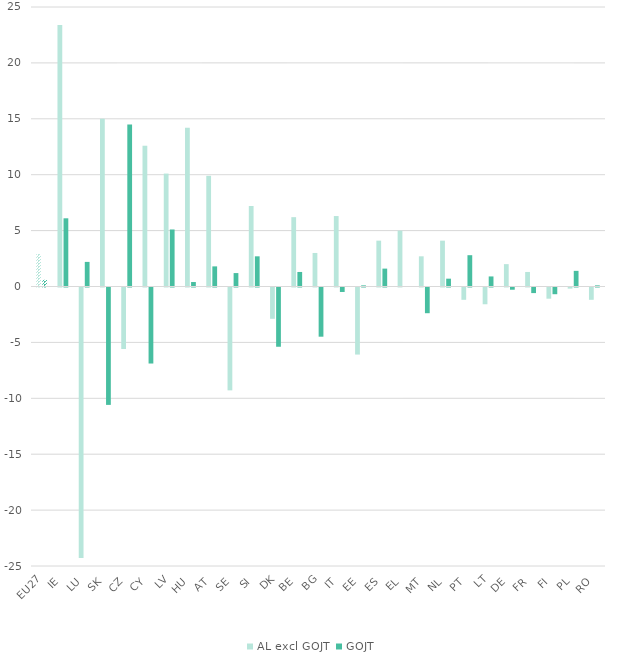
| Category | AL excl GOJT | GOJT |
|---|---|---|
| EU27 | 2.9 | 0.6 |
| IE | 23.4 | 6.1 |
| LU | -24.2 | 2.2 |
| SK | 15 | -10.5 |
| CZ | -5.5 | 14.5 |
| CY | 12.6 | -6.8 |
| LV | 10.1 | 5.1 |
| HU | 14.2 | 0.4 |
| AT | 9.9 | 1.8 |
| SE | -9.2 | 1.2 |
| SI | 7.2 | 2.7 |
| DK | -2.8 | -5.3 |
| BE | 6.2 | 1.3 |
| BG | 3 | -4.4 |
| IT | 6.3 | -0.4 |
| EE | -6 | 0.1 |
| ES | 4.1 | 1.6 |
| EL | 5 | 0 |
| MT | 2.7 | -2.3 |
| NL | 4.1 | 0.7 |
| PT | -1.1 | 2.8 |
| LT | -1.5 | 0.9 |
| DE | 2 | -0.2 |
| FR | 1.3 | -0.5 |
| FI | -1 | -0.6 |
| PL | -0.1 | 1.4 |
| RO | -1.1 | 0.1 |